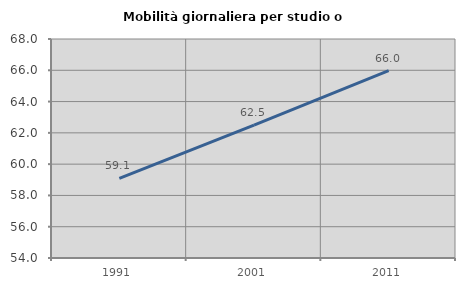
| Category | Mobilità giornaliera per studio o lavoro |
|---|---|
| 1991.0 | 59.093 |
| 2001.0 | 62.488 |
| 2011.0 | 65.98 |